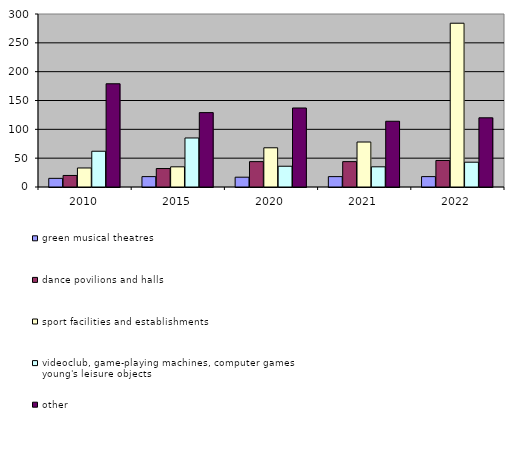
| Category | green musical theatres  | dance povilions and halls | sport facilities and establishments | videoclub, game-playing machines, computer games young's leisure objects  | other  |
|---|---|---|---|---|---|
| 2010.0 | 15 | 20 | 33 | 62 | 179 |
| 2015.0 | 18 | 32 | 35 | 85 | 129 |
| 2020.0 | 17 | 44 | 68 | 36 | 137 |
| 2021.0 | 18 | 44 | 78 | 35 | 114 |
| 2022.0 | 18 | 46 | 284 | 43 | 120 |